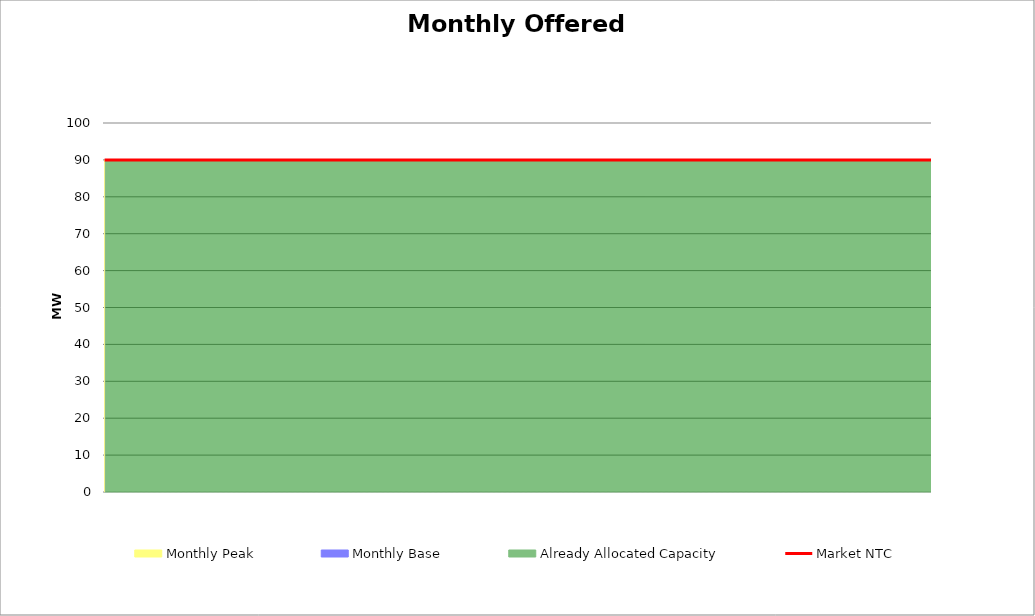
| Category | Market NTC |
|---|---|
| 0 | 90 |
| 1 | 90 |
| 2 | 90 |
| 3 | 90 |
| 4 | 90 |
| 5 | 90 |
| 6 | 90 |
| 7 | 90 |
| 8 | 90 |
| 9 | 90 |
| 10 | 90 |
| 11 | 90 |
| 12 | 90 |
| 13 | 90 |
| 14 | 90 |
| 15 | 90 |
| 16 | 90 |
| 17 | 90 |
| 18 | 90 |
| 19 | 90 |
| 20 | 90 |
| 21 | 90 |
| 22 | 90 |
| 23 | 90 |
| 24 | 90 |
| 25 | 90 |
| 26 | 90 |
| 27 | 90 |
| 28 | 90 |
| 29 | 90 |
| 30 | 90 |
| 31 | 90 |
| 32 | 90 |
| 33 | 90 |
| 34 | 90 |
| 35 | 90 |
| 36 | 90 |
| 37 | 90 |
| 38 | 90 |
| 39 | 90 |
| 40 | 90 |
| 41 | 90 |
| 42 | 90 |
| 43 | 90 |
| 44 | 90 |
| 45 | 90 |
| 46 | 90 |
| 47 | 90 |
| 48 | 90 |
| 49 | 90 |
| 50 | 90 |
| 51 | 90 |
| 52 | 90 |
| 53 | 90 |
| 54 | 90 |
| 55 | 90 |
| 56 | 90 |
| 57 | 90 |
| 58 | 90 |
| 59 | 90 |
| 60 | 90 |
| 61 | 90 |
| 62 | 90 |
| 63 | 90 |
| 64 | 90 |
| 65 | 90 |
| 66 | 90 |
| 67 | 90 |
| 68 | 90 |
| 69 | 90 |
| 70 | 90 |
| 71 | 90 |
| 72 | 90 |
| 73 | 90 |
| 74 | 90 |
| 75 | 90 |
| 76 | 90 |
| 77 | 90 |
| 78 | 90 |
| 79 | 90 |
| 80 | 90 |
| 81 | 90 |
| 82 | 90 |
| 83 | 90 |
| 84 | 90 |
| 85 | 90 |
| 86 | 90 |
| 87 | 90 |
| 88 | 90 |
| 89 | 90 |
| 90 | 90 |
| 91 | 90 |
| 92 | 90 |
| 93 | 90 |
| 94 | 90 |
| 95 | 90 |
| 96 | 90 |
| 97 | 90 |
| 98 | 90 |
| 99 | 90 |
| 100 | 90 |
| 101 | 90 |
| 102 | 90 |
| 103 | 90 |
| 104 | 90 |
| 105 | 90 |
| 106 | 90 |
| 107 | 90 |
| 108 | 90 |
| 109 | 90 |
| 110 | 90 |
| 111 | 90 |
| 112 | 90 |
| 113 | 90 |
| 114 | 90 |
| 115 | 90 |
| 116 | 90 |
| 117 | 90 |
| 118 | 90 |
| 119 | 90 |
| 120 | 90 |
| 121 | 90 |
| 122 | 90 |
| 123 | 90 |
| 124 | 90 |
| 125 | 90 |
| 126 | 90 |
| 127 | 90 |
| 128 | 90 |
| 129 | 90 |
| 130 | 90 |
| 131 | 90 |
| 132 | 90 |
| 133 | 90 |
| 134 | 90 |
| 135 | 90 |
| 136 | 90 |
| 137 | 90 |
| 138 | 90 |
| 139 | 90 |
| 140 | 90 |
| 141 | 90 |
| 142 | 90 |
| 143 | 90 |
| 144 | 90 |
| 145 | 90 |
| 146 | 90 |
| 147 | 90 |
| 148 | 90 |
| 149 | 90 |
| 150 | 90 |
| 151 | 90 |
| 152 | 90 |
| 153 | 90 |
| 154 | 90 |
| 155 | 90 |
| 156 | 90 |
| 157 | 90 |
| 158 | 90 |
| 159 | 90 |
| 160 | 90 |
| 161 | 90 |
| 162 | 90 |
| 163 | 90 |
| 164 | 90 |
| 165 | 90 |
| 166 | 90 |
| 167 | 90 |
| 168 | 90 |
| 169 | 90 |
| 170 | 90 |
| 171 | 90 |
| 172 | 90 |
| 173 | 90 |
| 174 | 90 |
| 175 | 90 |
| 176 | 90 |
| 177 | 90 |
| 178 | 90 |
| 179 | 90 |
| 180 | 90 |
| 181 | 90 |
| 182 | 90 |
| 183 | 90 |
| 184 | 90 |
| 185 | 90 |
| 186 | 90 |
| 187 | 90 |
| 188 | 90 |
| 189 | 90 |
| 190 | 90 |
| 191 | 90 |
| 192 | 90 |
| 193 | 90 |
| 194 | 90 |
| 195 | 90 |
| 196 | 90 |
| 197 | 90 |
| 198 | 90 |
| 199 | 90 |
| 200 | 90 |
| 201 | 90 |
| 202 | 90 |
| 203 | 90 |
| 204 | 90 |
| 205 | 90 |
| 206 | 90 |
| 207 | 90 |
| 208 | 90 |
| 209 | 90 |
| 210 | 90 |
| 211 | 90 |
| 212 | 90 |
| 213 | 90 |
| 214 | 90 |
| 215 | 90 |
| 216 | 90 |
| 217 | 90 |
| 218 | 90 |
| 219 | 90 |
| 220 | 90 |
| 221 | 90 |
| 222 | 90 |
| 223 | 90 |
| 224 | 90 |
| 225 | 90 |
| 226 | 90 |
| 227 | 90 |
| 228 | 90 |
| 229 | 90 |
| 230 | 90 |
| 231 | 90 |
| 232 | 90 |
| 233 | 90 |
| 234 | 90 |
| 235 | 90 |
| 236 | 90 |
| 237 | 90 |
| 238 | 90 |
| 239 | 90 |
| 240 | 90 |
| 241 | 90 |
| 242 | 90 |
| 243 | 90 |
| 244 | 90 |
| 245 | 90 |
| 246 | 90 |
| 247 | 90 |
| 248 | 90 |
| 249 | 90 |
| 250 | 90 |
| 251 | 90 |
| 252 | 90 |
| 253 | 90 |
| 254 | 90 |
| 255 | 90 |
| 256 | 90 |
| 257 | 90 |
| 258 | 90 |
| 259 | 90 |
| 260 | 90 |
| 261 | 90 |
| 262 | 90 |
| 263 | 90 |
| 264 | 90 |
| 265 | 90 |
| 266 | 90 |
| 267 | 90 |
| 268 | 90 |
| 269 | 90 |
| 270 | 90 |
| 271 | 90 |
| 272 | 90 |
| 273 | 90 |
| 274 | 90 |
| 275 | 90 |
| 276 | 90 |
| 277 | 90 |
| 278 | 90 |
| 279 | 90 |
| 280 | 90 |
| 281 | 90 |
| 282 | 90 |
| 283 | 90 |
| 284 | 90 |
| 285 | 90 |
| 286 | 90 |
| 287 | 90 |
| 288 | 90 |
| 289 | 90 |
| 290 | 90 |
| 291 | 90 |
| 292 | 90 |
| 293 | 90 |
| 294 | 90 |
| 295 | 90 |
| 296 | 90 |
| 297 | 90 |
| 298 | 90 |
| 299 | 90 |
| 300 | 90 |
| 301 | 90 |
| 302 | 90 |
| 303 | 90 |
| 304 | 90 |
| 305 | 90 |
| 306 | 90 |
| 307 | 90 |
| 308 | 90 |
| 309 | 90 |
| 310 | 90 |
| 311 | 90 |
| 312 | 90 |
| 313 | 90 |
| 314 | 90 |
| 315 | 90 |
| 316 | 90 |
| 317 | 90 |
| 318 | 90 |
| 319 | 90 |
| 320 | 90 |
| 321 | 90 |
| 322 | 90 |
| 323 | 90 |
| 324 | 90 |
| 325 | 90 |
| 326 | 90 |
| 327 | 90 |
| 328 | 90 |
| 329 | 90 |
| 330 | 90 |
| 331 | 90 |
| 332 | 90 |
| 333 | 90 |
| 334 | 90 |
| 335 | 90 |
| 336 | 90 |
| 337 | 90 |
| 338 | 90 |
| 339 | 90 |
| 340 | 90 |
| 341 | 90 |
| 342 | 90 |
| 343 | 90 |
| 344 | 90 |
| 345 | 90 |
| 346 | 90 |
| 347 | 90 |
| 348 | 90 |
| 349 | 90 |
| 350 | 90 |
| 351 | 90 |
| 352 | 90 |
| 353 | 90 |
| 354 | 90 |
| 355 | 90 |
| 356 | 90 |
| 357 | 90 |
| 358 | 90 |
| 359 | 90 |
| 360 | 90 |
| 361 | 90 |
| 362 | 90 |
| 363 | 90 |
| 364 | 90 |
| 365 | 90 |
| 366 | 90 |
| 367 | 90 |
| 368 | 90 |
| 369 | 90 |
| 370 | 90 |
| 371 | 90 |
| 372 | 90 |
| 373 | 90 |
| 374 | 90 |
| 375 | 90 |
| 376 | 90 |
| 377 | 90 |
| 378 | 90 |
| 379 | 90 |
| 380 | 90 |
| 381 | 90 |
| 382 | 90 |
| 383 | 90 |
| 384 | 90 |
| 385 | 90 |
| 386 | 90 |
| 387 | 90 |
| 388 | 90 |
| 389 | 90 |
| 390 | 90 |
| 391 | 90 |
| 392 | 90 |
| 393 | 90 |
| 394 | 90 |
| 395 | 90 |
| 396 | 90 |
| 397 | 90 |
| 398 | 90 |
| 399 | 90 |
| 400 | 90 |
| 401 | 90 |
| 402 | 90 |
| 403 | 90 |
| 404 | 90 |
| 405 | 90 |
| 406 | 90 |
| 407 | 90 |
| 408 | 90 |
| 409 | 90 |
| 410 | 90 |
| 411 | 90 |
| 412 | 90 |
| 413 | 90 |
| 414 | 90 |
| 415 | 90 |
| 416 | 90 |
| 417 | 90 |
| 418 | 90 |
| 419 | 90 |
| 420 | 90 |
| 421 | 90 |
| 422 | 90 |
| 423 | 90 |
| 424 | 90 |
| 425 | 90 |
| 426 | 90 |
| 427 | 90 |
| 428 | 90 |
| 429 | 90 |
| 430 | 90 |
| 431 | 90 |
| 432 | 90 |
| 433 | 90 |
| 434 | 90 |
| 435 | 90 |
| 436 | 90 |
| 437 | 90 |
| 438 | 90 |
| 439 | 90 |
| 440 | 90 |
| 441 | 90 |
| 442 | 90 |
| 443 | 90 |
| 444 | 90 |
| 445 | 90 |
| 446 | 90 |
| 447 | 90 |
| 448 | 90 |
| 449 | 90 |
| 450 | 90 |
| 451 | 90 |
| 452 | 90 |
| 453 | 90 |
| 454 | 90 |
| 455 | 90 |
| 456 | 90 |
| 457 | 90 |
| 458 | 90 |
| 459 | 90 |
| 460 | 90 |
| 461 | 90 |
| 462 | 90 |
| 463 | 90 |
| 464 | 90 |
| 465 | 90 |
| 466 | 90 |
| 467 | 90 |
| 468 | 90 |
| 469 | 90 |
| 470 | 90 |
| 471 | 90 |
| 472 | 90 |
| 473 | 90 |
| 474 | 90 |
| 475 | 90 |
| 476 | 90 |
| 477 | 90 |
| 478 | 90 |
| 479 | 90 |
| 480 | 90 |
| 481 | 90 |
| 482 | 90 |
| 483 | 90 |
| 484 | 90 |
| 485 | 90 |
| 486 | 90 |
| 487 | 90 |
| 488 | 90 |
| 489 | 90 |
| 490 | 90 |
| 491 | 90 |
| 492 | 90 |
| 493 | 90 |
| 494 | 90 |
| 495 | 90 |
| 496 | 90 |
| 497 | 90 |
| 498 | 90 |
| 499 | 90 |
| 500 | 90 |
| 501 | 90 |
| 502 | 90 |
| 503 | 90 |
| 504 | 90 |
| 505 | 90 |
| 506 | 90 |
| 507 | 90 |
| 508 | 90 |
| 509 | 90 |
| 510 | 90 |
| 511 | 90 |
| 512 | 90 |
| 513 | 90 |
| 514 | 90 |
| 515 | 90 |
| 516 | 90 |
| 517 | 90 |
| 518 | 90 |
| 519 | 90 |
| 520 | 90 |
| 521 | 90 |
| 522 | 90 |
| 523 | 90 |
| 524 | 90 |
| 525 | 90 |
| 526 | 90 |
| 527 | 90 |
| 528 | 90 |
| 529 | 90 |
| 530 | 90 |
| 531 | 90 |
| 532 | 90 |
| 533 | 90 |
| 534 | 90 |
| 535 | 90 |
| 536 | 90 |
| 537 | 90 |
| 538 | 90 |
| 539 | 90 |
| 540 | 90 |
| 541 | 90 |
| 542 | 90 |
| 543 | 90 |
| 544 | 90 |
| 545 | 90 |
| 546 | 90 |
| 547 | 90 |
| 548 | 90 |
| 549 | 90 |
| 550 | 90 |
| 551 | 90 |
| 552 | 90 |
| 553 | 90 |
| 554 | 90 |
| 555 | 90 |
| 556 | 90 |
| 557 | 90 |
| 558 | 90 |
| 559 | 90 |
| 560 | 90 |
| 561 | 90 |
| 562 | 90 |
| 563 | 90 |
| 564 | 90 |
| 565 | 90 |
| 566 | 90 |
| 567 | 90 |
| 568 | 90 |
| 569 | 90 |
| 570 | 90 |
| 571 | 90 |
| 572 | 90 |
| 573 | 90 |
| 574 | 90 |
| 575 | 90 |
| 576 | 90 |
| 577 | 90 |
| 578 | 90 |
| 579 | 90 |
| 580 | 90 |
| 581 | 90 |
| 582 | 90 |
| 583 | 90 |
| 584 | 90 |
| 585 | 90 |
| 586 | 90 |
| 587 | 90 |
| 588 | 90 |
| 589 | 90 |
| 590 | 90 |
| 591 | 90 |
| 592 | 90 |
| 593 | 90 |
| 594 | 90 |
| 595 | 90 |
| 596 | 90 |
| 597 | 90 |
| 598 | 90 |
| 599 | 90 |
| 600 | 90 |
| 601 | 90 |
| 602 | 90 |
| 603 | 90 |
| 604 | 90 |
| 605 | 90 |
| 606 | 90 |
| 607 | 90 |
| 608 | 90 |
| 609 | 90 |
| 610 | 90 |
| 611 | 90 |
| 612 | 90 |
| 613 | 90 |
| 614 | 90 |
| 615 | 90 |
| 616 | 90 |
| 617 | 90 |
| 618 | 90 |
| 619 | 90 |
| 620 | 90 |
| 621 | 90 |
| 622 | 90 |
| 623 | 90 |
| 624 | 90 |
| 625 | 90 |
| 626 | 90 |
| 627 | 90 |
| 628 | 90 |
| 629 | 90 |
| 630 | 90 |
| 631 | 90 |
| 632 | 90 |
| 633 | 90 |
| 634 | 90 |
| 635 | 90 |
| 636 | 90 |
| 637 | 90 |
| 638 | 90 |
| 639 | 90 |
| 640 | 90 |
| 641 | 90 |
| 642 | 90 |
| 643 | 90 |
| 644 | 90 |
| 645 | 90 |
| 646 | 90 |
| 647 | 90 |
| 648 | 90 |
| 649 | 90 |
| 650 | 90 |
| 651 | 90 |
| 652 | 90 |
| 653 | 90 |
| 654 | 90 |
| 655 | 90 |
| 656 | 90 |
| 657 | 90 |
| 658 | 90 |
| 659 | 90 |
| 660 | 90 |
| 661 | 90 |
| 662 | 90 |
| 663 | 90 |
| 664 | 90 |
| 665 | 90 |
| 666 | 90 |
| 667 | 90 |
| 668 | 90 |
| 669 | 90 |
| 670 | 90 |
| 671 | 90 |